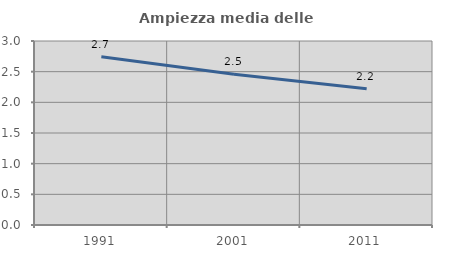
| Category | Ampiezza media delle famiglie |
|---|---|
| 1991.0 | 2.742 |
| 2001.0 | 2.459 |
| 2011.0 | 2.221 |